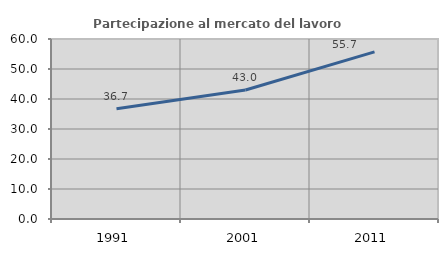
| Category | Partecipazione al mercato del lavoro  femminile |
|---|---|
| 1991.0 | 36.735 |
| 2001.0 | 42.982 |
| 2011.0 | 55.691 |